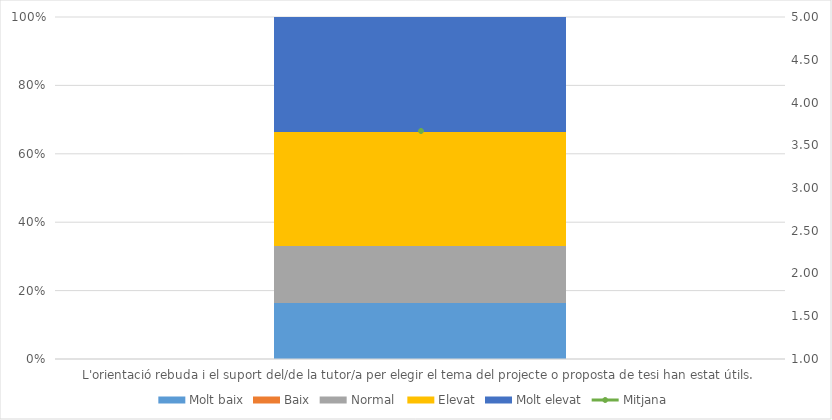
| Category | Molt baix | Baix | Normal  | Elevat | Molt elevat |
|---|---|---|---|---|---|
| L'orientació rebuda i el suport del/de la tutor/a per elegir el tema del projecte o proposta de tesi han estat útils. | 1 | 0 | 1 | 2 | 2 |